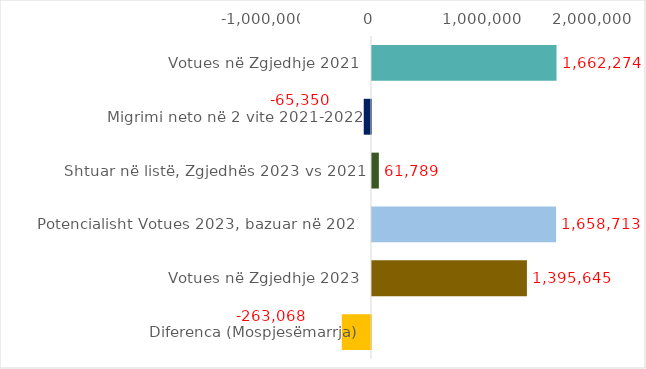
| Category | Series 0 |
|---|---|
| Votues në Zgjedhje 2021 | 1662274 |
| Migrimi neto në 2 vite 2021-2022 | -65350 |
| Shtuar në listë, Zgjedhës 2023 vs 2021 | 61789 |
| Potencialisht Votues 2023, bazuar në 2021 | 1658713 |
| Votues në Zgjedhje 2023 | 1395645 |
| Diferenca (Mospjesëmarrja) | -263068 |